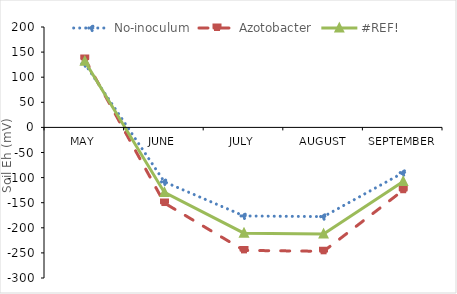
| Category | No-inoculum | Azotobacter | #REF! |
|---|---|---|---|
| May | 126.94 | 136.5 | 131.72 |
| June | -108.48 | -150.667 | -129.573 |
| July | -176.4 | -245 | -210.7 |
| August | -177.72 | -246.833 | -212.277 |
| September | -90.12 | -125.167 | -107.643 |